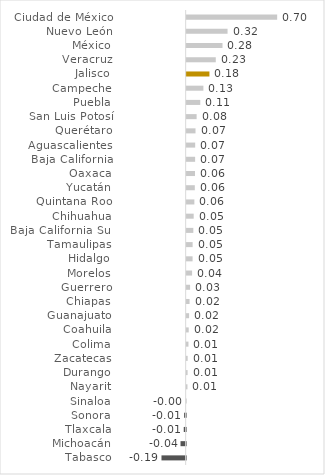
| Category | Series 0 |
|---|---|
| Tabasco | -0.187 |
| Michoacán | -0.04 |
| Tlaxcala | -0.015 |
| Sonora | -0.012 |
| Sinaloa | -0.001 |
| Nayarit | 0.006 |
| Durango | 0.007 |
| Zacatecas | 0.008 |
| Colima | 0.014 |
| Coahuila | 0.016 |
| Guanajuato | 0.019 |
| Chiapas | 0.022 |
| Guerrero | 0.026 |
| Morelos | 0.042 |
| Hidalgo | 0.046 |
| Tamaulipas | 0.046 |
| Baja California Sur | 0.051 |
| Chihuahua | 0.054 |
| Quintana Roo | 0.06 |
| Yucatán | 0.063 |
| Oaxaca | 0.065 |
| Baja California | 0.065 |
| Aguascalientes | 0.066 |
| Querétaro | 0.068 |
| San Luis Potosí | 0.077 |
| Puebla | 0.105 |
| Campeche | 0.129 |
| Jalisco | 0.176 |
| Veracruz | 0.225 |
| México | 0.277 |
| Nuevo León | 0.316 |
| Ciudad de México | 0.7 |